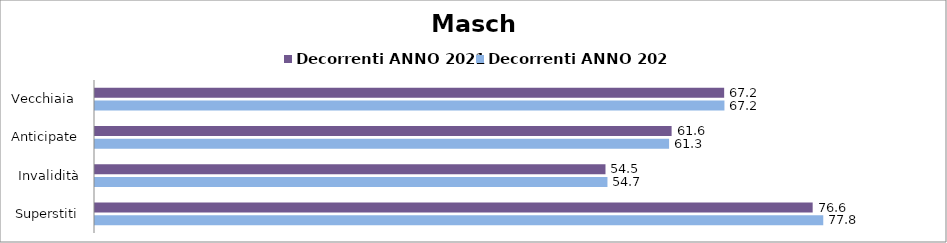
| Category | Decorrenti ANNO 2021 | Decorrenti ANNO 2022 |
|---|---|---|
| Vecchiaia  | 67.17 | 67.2 |
| Anticipate | 61.56 | 61.29 |
| Invalidità | 54.5 | 54.71 |
| Superstiti | 76.62 | 77.75 |